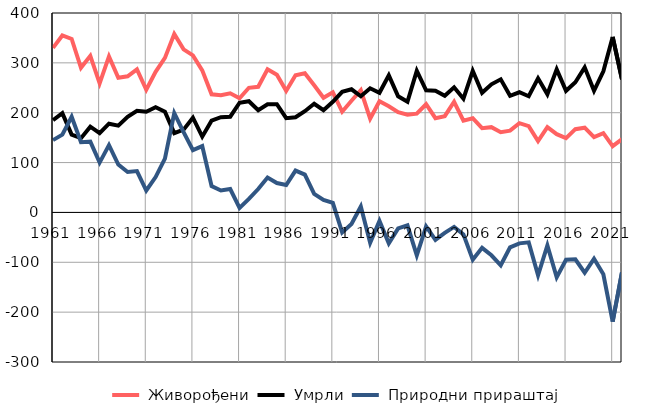
| Category |  Живорођени |  Умрли |  Природни прираштај |
|---|---|---|---|
| 1961.0 | 330 | 185 | 145 |
| 1962.0 | 355 | 199 | 156 |
| 1963.0 | 348 | 156 | 192 |
| 1964.0 | 290 | 149 | 141 |
| 1965.0 | 314 | 172 | 142 |
| 1966.0 | 259 | 159 | 100 |
| 1967.0 | 313 | 178 | 135 |
| 1968.0 | 270 | 174 | 96 |
| 1969.0 | 273 | 192 | 81 |
| 1970.0 | 287 | 204 | 83 |
| 1971.0 | 246 | 202 | 44 |
| 1972.0 | 282 | 211 | 71 |
| 1973.0 | 310 | 202 | 108 |
| 1974.0 | 358 | 159 | 199 |
| 1975.0 | 327 | 166 | 161 |
| 1976.0 | 315 | 190 | 125 |
| 1977.0 | 285 | 152 | 133 |
| 1978.0 | 237 | 184 | 53 |
| 1979.0 | 235 | 191 | 44 |
| 1980.0 | 239 | 192 | 47 |
| 1981.0 | 229 | 220 | 9 |
| 1982.0 | 250 | 223 | 27 |
| 1983.0 | 252 | 205 | 47 |
| 1984.0 | 287 | 217 | 70 |
| 1985.0 | 276 | 217 | 59 |
| 1986.0 | 244 | 189 | 55 |
| 1987.0 | 275 | 191 | 84 |
| 1988.0 | 279 | 203 | 76 |
| 1989.0 | 255 | 218 | 37 |
| 1990.0 | 230 | 205 | 25 |
| 1991.0 | 241 | 222 | 19 |
| 1992.0 | 202 | 242 | -40 |
| 1993.0 | 224 | 247 | -23 |
| 1994.0 | 245 | 233 | 12 |
| 1995.0 | 188 | 249 | -61 |
| 1996.0 | 223 | 240 | -17 |
| 1997.0 | 213 | 275 | -62 |
| 1998.0 | 201 | 233 | -32 |
| 1999.0 | 196 | 222 | -26 |
| 2000.0 | 198 | 284 | -86 |
| 2001.0 | 217 | 245 | -28 |
| 2002.0 | 189 | 244 | -55 |
| 2003.0 | 193 | 234 | -41 |
| 2004.0 | 222 | 251 | -29 |
| 2005.0 | 184 | 228 | -44 |
| 2006.0 | 189 | 284 | -95 |
| 2007.0 | 169 | 240 | -71 |
| 2008.0 | 171 | 257 | -86 |
| 2009.0 | 161 | 267 | -106 |
| 2010.0 | 164 | 234 | -70 |
| 2011.0 | 179 | 241 | -62 |
| 2012.0 | 173 | 233 | -60 |
| 2013.0 | 143 | 269 | -126 |
| 2014.0 | 171 | 237 | -66 |
| 2015.0 | 157 | 287 | -130 |
| 2016.0 | 149 | 244 | -95 |
| 2017.0 | 167 | 261 | -94 |
| 2018.0 | 170 | 291 | -121 |
| 2019.0 | 151 | 244 | -93 |
| 2020.0 | 159 | 283 | -124 |
| 2021.0 | 133 | 352 | -219 |
| 2022.0 | 147 | 267 | -120 |